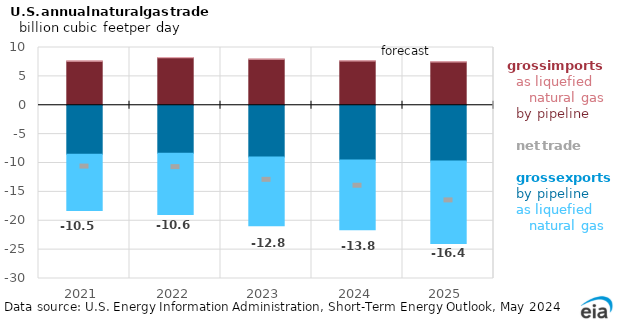
| Category | pipeline imports | LNG imports | pipeline exports | LNG exports |
|---|---|---|---|---|
| 2021.0 | 7.633 | 0.059 | -8.471 | -9.756 |
| 2022.0 | 8.215 | 0.069 | -8.324 | -10.591 |
| 2023.0 | 7.983 | 0.042 | -8.952 | -11.9 |
| 2024.0 | 7.655 | 0.059 | -9.46 | -12.101 |
| 2025.0 | 7.493 | 0.059 | -9.646 | -14.296 |